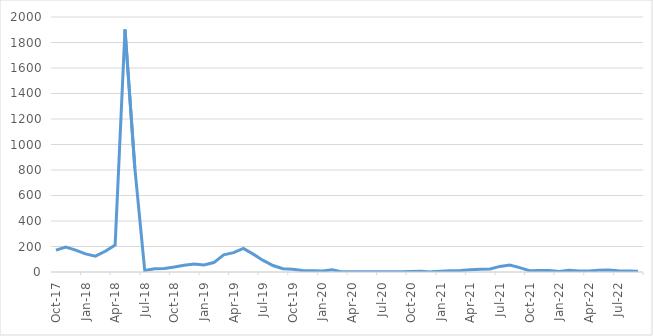
| Category | Frequency |
|---|---|
| 2017-10-01 | 171 |
| 2017-11-01 | 196 |
| 2017-12-01 | 171 |
| 2018-01-01 | 142 |
| 2018-02-01 | 124 |
| 2018-03-01 | 163 |
| 2018-04-01 | 211 |
| 2018-05-01 | 1902 |
| 2018-06-01 | 812 |
| 2018-07-01 | 12 |
| 2018-08-01 | 26 |
| 2018-09-01 | 27 |
| 2018-10-01 | 39 |
| 2018-11-01 | 53 |
| 2018-12-01 | 62 |
| 2019-01-01 | 55 |
| 2019-02-01 | 74 |
| 2019-03-01 | 135 |
| 2019-04-01 | 152 |
| 2019-05-01 | 185 |
| 2019-06-01 | 140 |
| 2019-07-01 | 91 |
| 2019-08-01 | 51 |
| 2019-09-01 | 26 |
| 2019-10-01 | 21 |
| 2019-11-01 | 12 |
| 2019-12-01 | 10 |
| 2020-01-01 | 7 |
| 2020-02-01 | 18 |
| 2020-03-01 | 1 |
| 2020-04-01 | 2 |
| 2020-05-01 | 2 |
| 2020-09-01 | 2 |
| 2020-11-01 | 6 |
| 2020-12-01 | 1 |
| 2021-01-01 | 5 |
| 2021-02-01 | 9 |
| 2021-03-01 | 12 |
| 2021-04-01 | 18 |
| 2021-05-01 | 21 |
| 2021-06-01 | 24 |
| 2021-07-01 | 44 |
| 2021-08-01 | 54 |
| 2021-09-01 | 34 |
| 2021-10-01 | 10 |
| 2021-11-01 | 12 |
| 2021-12-01 | 11 |
| 2022-01-01 | 4 |
| 2022-02-01 | 13 |
| 2022-03-01 | 7 |
| 2022-04-01 | 7 |
| 2022-05-01 | 14 |
| 2022-06-01 | 15 |
| 2022-07-01 | 10 |
| 2022-08-01 | 8 |
| 2022-09-01 | 5 |